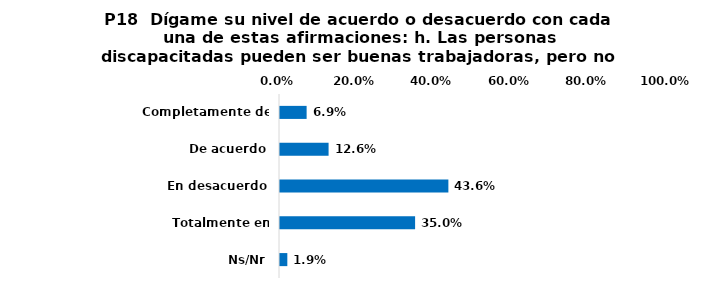
| Category | Series 0 |
|---|---|
| Completamente de acuerdo | 0.069 |
| De acuerdo | 0.126 |
| En desacuerdo | 0.436 |
| Totalmente en desacuerdo | 0.35 |
| Ns/Nr | 0.019 |